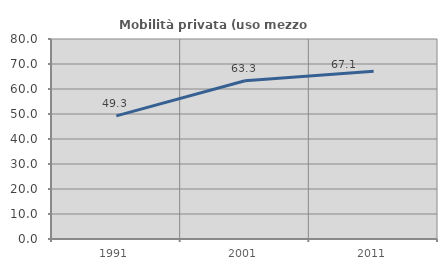
| Category | Mobilità privata (uso mezzo privato) |
|---|---|
| 1991.0 | 49.252 |
| 2001.0 | 63.276 |
| 2011.0 | 67.091 |